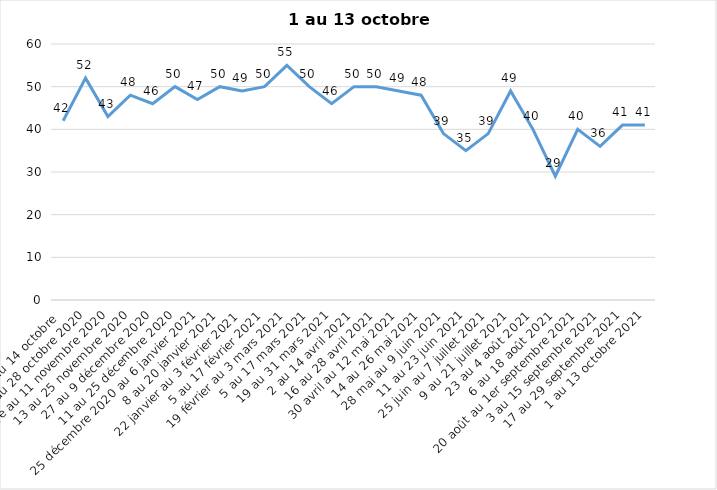
| Category | Toujours aux trois mesures |
|---|---|
| 2 au 14 octobre  | 42 |
| 16 au 28 octobre 2020 | 52 |
| 30 octobre au 11 novembre 2020 | 43 |
| 13 au 25 novembre 2020 | 48 |
| 27 au 9 décembre 2020 | 46 |
| 11 au 25 décembre 2020 | 50 |
| 25 décembre 2020 au 6 janvier 2021 | 47 |
| 8 au 20 janvier 2021 | 50 |
| 22 janvier au 3 février 2021 | 49 |
| 5 au 17 février 2021 | 50 |
| 19 février au 3 mars 2021 | 55 |
| 5 au 17 mars 2021 | 50 |
| 19 au 31 mars 2021 | 46 |
| 2 au 14 avril 2021 | 50 |
| 16 au 28 avril 2021 | 50 |
| 30 avril au 12 mai 2021 | 49 |
| 14 au 26 mai 2021 | 48 |
| 28 mai au 9 juin 2021 | 39 |
| 11 au 23 juin 2021 | 35 |
| 25 juin au 7 juillet 2021 | 39 |
| 9 au 21 juillet 2021 | 49 |
| 23 au 4 août 2021 | 40 |
| 6 au 18 août 2021 | 29 |
| 20 août au 1er septembre 2021 | 40 |
| 3 au 15 septembre 2021 | 36 |
| 17 au 29 septembre 2021 | 41 |
| 1 au 13 octobre 2021 | 41 |